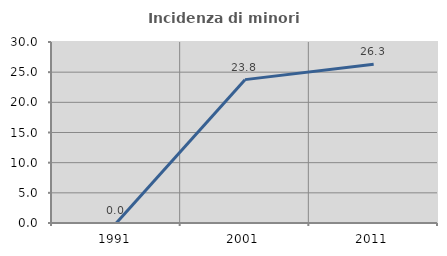
| Category | Incidenza di minori stranieri |
|---|---|
| 1991.0 | 0 |
| 2001.0 | 23.762 |
| 2011.0 | 26.316 |